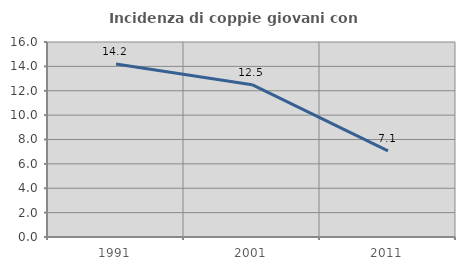
| Category | Incidenza di coppie giovani con figli |
|---|---|
| 1991.0 | 14.189 |
| 2001.0 | 12.5 |
| 2011.0 | 7.063 |